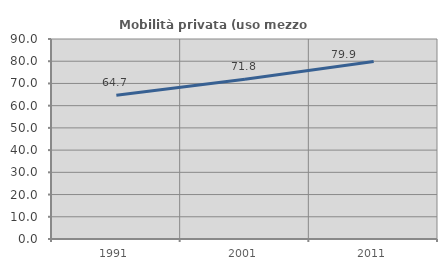
| Category | Mobilità privata (uso mezzo privato) |
|---|---|
| 1991.0 | 64.688 |
| 2001.0 | 71.839 |
| 2011.0 | 79.919 |